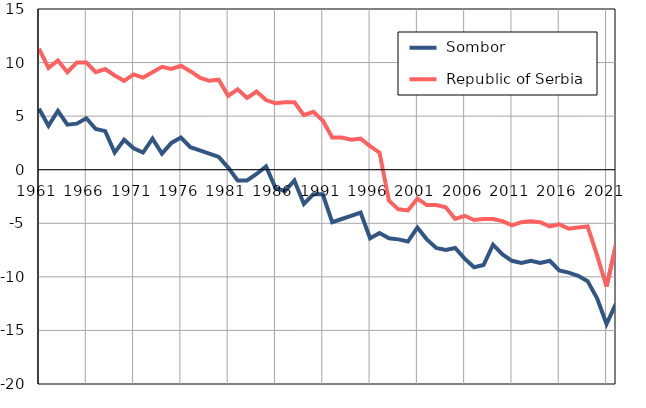
| Category |  Sombor |  Republic of Serbia |
|---|---|---|
| 1961.0 | 5.7 | 11.3 |
| 1962.0 | 4.1 | 9.5 |
| 1963.0 | 5.5 | 10.2 |
| 1964.0 | 4.2 | 9.1 |
| 1965.0 | 4.3 | 10 |
| 1966.0 | 4.8 | 10 |
| 1967.0 | 3.8 | 9.1 |
| 1968.0 | 3.6 | 9.4 |
| 1969.0 | 1.6 | 8.8 |
| 1970.0 | 2.8 | 8.3 |
| 1971.0 | 2 | 8.9 |
| 1972.0 | 1.6 | 8.6 |
| 1973.0 | 2.9 | 9.1 |
| 1974.0 | 1.5 | 9.6 |
| 1975.0 | 2.5 | 9.4 |
| 1976.0 | 3 | 9.7 |
| 1977.0 | 2.1 | 9.2 |
| 1978.0 | 1.8 | 8.6 |
| 1979.0 | 1.5 | 8.3 |
| 1980.0 | 1.2 | 8.4 |
| 1981.0 | 0.2 | 6.9 |
| 1982.0 | -1 | 7.5 |
| 1983.0 | -1 | 6.7 |
| 1984.0 | -0.4 | 7.3 |
| 1985.0 | 0.3 | 6.5 |
| 1986.0 | -1.7 | 6.2 |
| 1987.0 | -2 | 6.3 |
| 1988.0 | -1 | 6.3 |
| 1989.0 | -3.2 | 5.1 |
| 1990.0 | -2.3 | 5.4 |
| 1991.0 | -2.3 | 4.6 |
| 1992.0 | -4.9 | 3 |
| 1993.0 | -4.6 | 3 |
| 1994.0 | -4.3 | 2.8 |
| 1995.0 | -4 | 2.9 |
| 1996.0 | -6.4 | 2.2 |
| 1997.0 | -5.9 | 1.6 |
| 1998.0 | -6.4 | -2.9 |
| 1999.0 | -6.5 | -3.7 |
| 2000.0 | -6.7 | -3.8 |
| 2001.0 | -5.4 | -2.7 |
| 2002.0 | -6.5 | -3.3 |
| 2003.0 | -7.3 | -3.3 |
| 2004.0 | -7.5 | -3.5 |
| 2005.0 | -7.3 | -4.6 |
| 2006.0 | -8.3 | -4.3 |
| 2007.0 | -9.1 | -4.7 |
| 2008.0 | -8.9 | -4.6 |
| 2009.0 | -7 | -4.6 |
| 2010.0 | -7.9 | -4.8 |
| 2011.0 | -8.5 | -5.2 |
| 2012.0 | -8.7 | -4.9 |
| 2013.0 | -8.5 | -4.8 |
| 2014.0 | -8.7 | -4.9 |
| 2015.0 | -8.5 | -5.3 |
| 2016.0 | -9.4 | -5.1 |
| 2017.0 | -9.6 | -5.5 |
| 2018.0 | -9.9 | -5.4 |
| 2019.0 | -10.4 | -5.3 |
| 2020.0 | -12 | -8 |
| 2021.0 | -14.4 | -10.9 |
| 2022.0 | -12.5 | -7 |